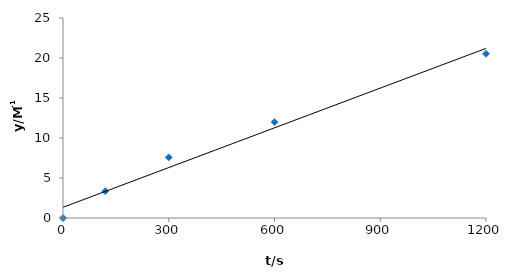
| Category | Series 0 |
|---|---|
| 0.0 | 0 |
| 120.0 | 3.35 |
| 300.0 | 7.579 |
| 600.0 | 11.978 |
| 1200.0 | 20.526 |